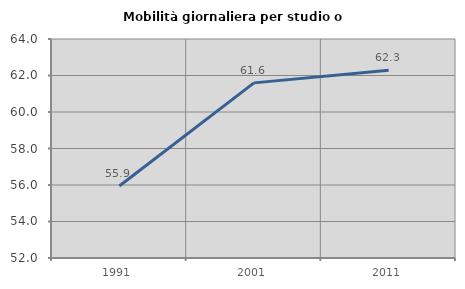
| Category | Mobilità giornaliera per studio o lavoro |
|---|---|
| 1991.0 | 55.942 |
| 2001.0 | 61.596 |
| 2011.0 | 62.288 |